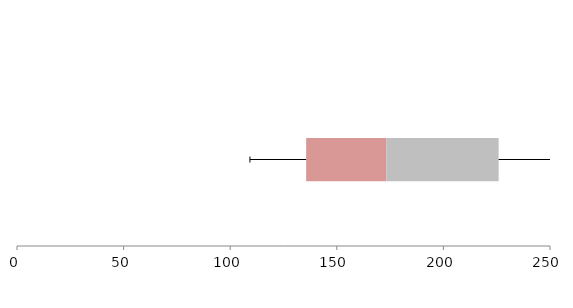
| Category | Series 1 | Series 2 | Series 3 |
|---|---|---|---|
| 0 | 135.625 | 37.582 | 52.695 |